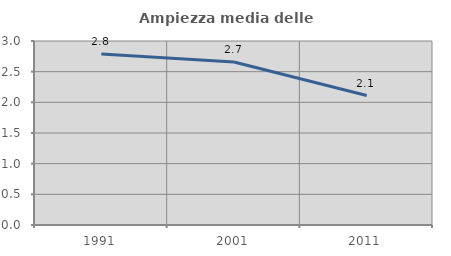
| Category | Ampiezza media delle famiglie |
|---|---|
| 1991.0 | 2.787 |
| 2001.0 | 2.657 |
| 2011.0 | 2.111 |